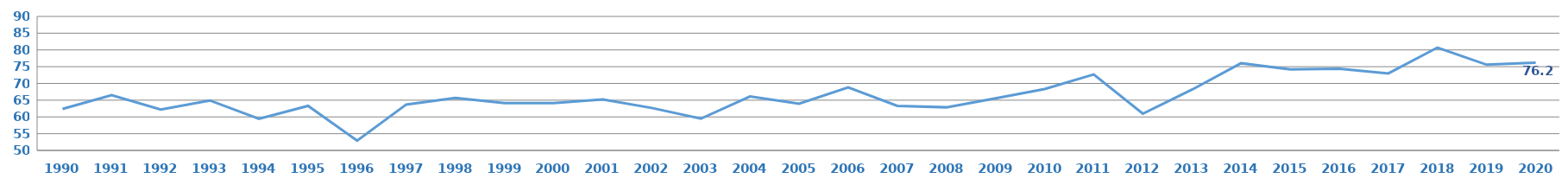
| Category | BEP |
|---|---|
| 1990.0 | 62.4 |
| 1991.0 | 66.5 |
| 1992.0 | 62.2 |
| 1993.0 | 64.912 |
| 1994.0 | 59.434 |
| 1995.0 | 63.301 |
| 1996.0 | 52.919 |
| 1997.0 | 63.705 |
| 1998.0 | 65.679 |
| 1999.0 | 64.143 |
| 2000.0 | 64.099 |
| 2001.0 | 65.212 |
| 2002.0 | 62.68 |
| 2003.0 | 59.48 |
| 2004.0 | 66.097 |
| 2005.0 | 63.944 |
| 2006.0 | 68.83 |
| 2007.0 | 63.305 |
| 2008.0 | 62.872 |
| 2009.0 | 65.553 |
| 2010.0 | 68.325 |
| 2011.0 | 72.667 |
| 2012.0 | 60.963 |
| 2013.0 | 68.139 |
| 2014.0 | 76.024 |
| 2015.0 | 74.199 |
| 2016.0 | 74.403 |
| 2017.0 | 73 |
| 2018.0 | 80.7 |
| 2019.0 | 75.6 |
| 2020.0 | 76.2 |